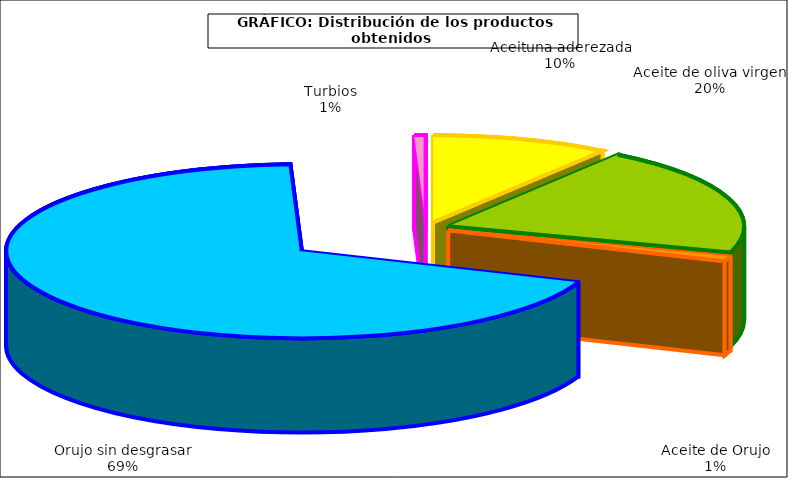
| Category | Series 1 |
|---|---|
| 0 | 718198 |
| 1 | 1492069 |
| 2 | 69486 |
| 3 | 5075848 |
| 4 | 45783 |